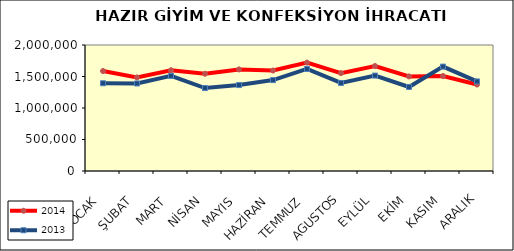
| Category | 2014 | 2013 |
|---|---|---|
| OCAK | 1586677.852 | 1392631.839 |
| ŞUBAT | 1485372.277 | 1389471.283 |
| MART | 1599262.229 | 1509882.693 |
| NİSAN | 1543748.1 | 1316507.372 |
| MAYIS | 1612654.465 | 1364077.875 |
| HAZİRAN | 1595124.277 | 1442883.876 |
| TEMMUZ | 1720250.582 | 1619796.147 |
| AGUSTOS | 1553594.273 | 1397333.618 |
| EYLÜL | 1665899.748 | 1514552.258 |
| EKİM | 1501535.19 | 1334120.2 |
| KASIM | 1507371.453 | 1657209.258 |
| ARALIK | 1372214.968 | 1421635.633 |